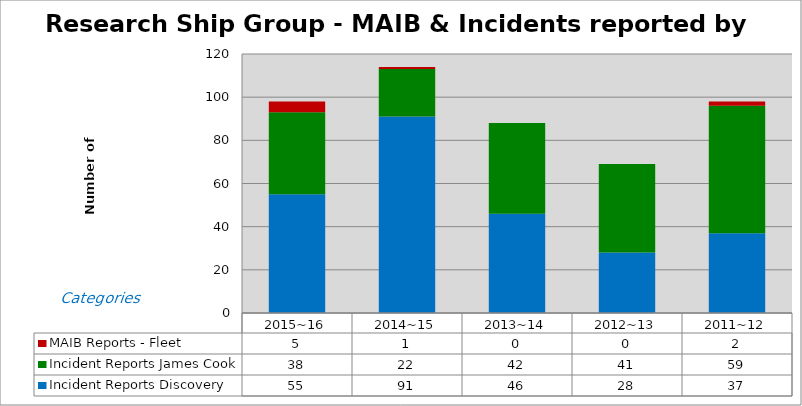
| Category | Incident Reports Discovery | Incident Reports James Cook | MAIB Reports - Fleet |
|---|---|---|---|
| 2015~16 | 55 | 38 | 5 |
| 2014~15 | 91 | 22 | 1 |
| 2013~14 | 46 | 42 | 0 |
| 2012~13 | 28 | 41 | 0 |
| 2011~12 | 37 | 59 | 2 |